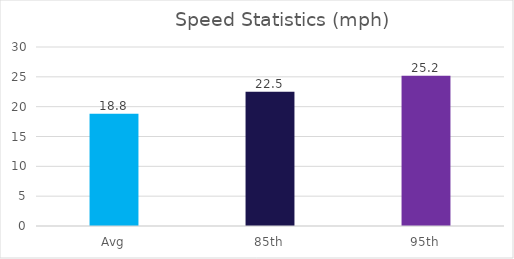
| Category | Series 0 |
|---|---|
| Avg | 18.8 |
| 85th | 22.5 |
| 95th | 25.2 |